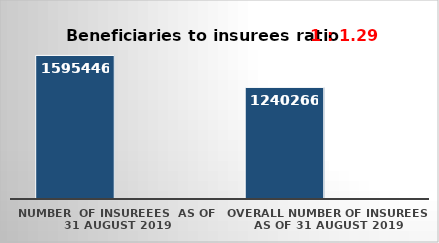
| Category | Series 0 | Series 1 |
|---|---|---|
| NUMBER  of insureees  as of  31 August 2019 | 1595446 |  |
| OVERALL number of insurees as of 31 August 2019 | 1240266 |  |